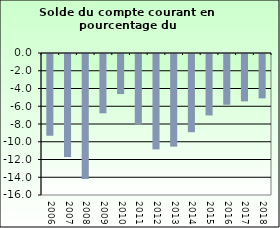
| Category | Current Account Balance |
|---|---|
| 2006.0 | -9.21 |
| 2007.0 | -11.611 |
| 2008.0 | -14.086 |
| 2009.0 | -6.68 |
| 2010.0 | -4.514 |
| 2011.0 | -7.977 |
| 2012.0 | -10.749 |
| 2013.0 | -10.436 |
| 2014.0 | -8.815 |
| 2015.0 | -6.925 |
| 2016.0 | -5.72 |
| 2017.0 | -5.339 |
| 2018.0 | -5.001 |